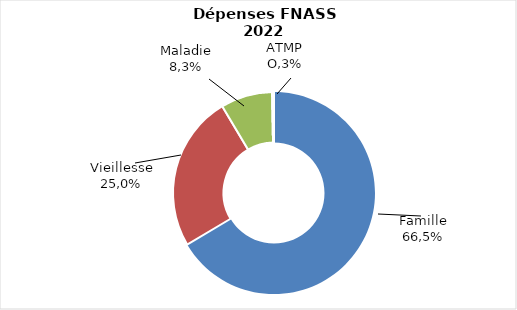
| Category | Series 0 |
|---|---|
| Famille  | 114228786 |
| Vieillesse | 42894738 |
| Maladie | 14180104 |
| ATMP | 531515 |